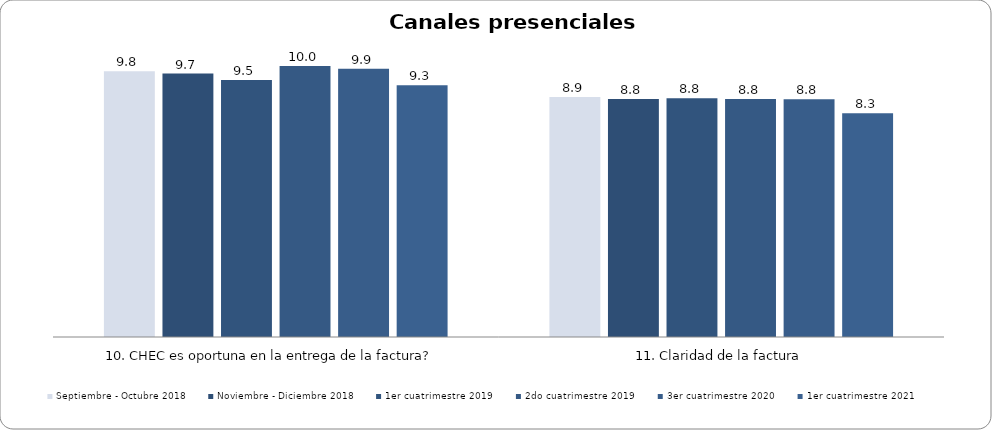
| Category | Septiembre - Octubre 2018 | Noviembre - Diciembre 2018 | 1er cuatrimestre 2019 | 2do cuatrimestre 2019 | 3er cuatrimestre 2020 | 1er cuatrimestre 2021 |
|---|---|---|---|---|---|---|
| 10. CHEC es oportuna en la entrega de la factura? | 9.808 | 9.722 | 9.485 | 10 | 9.896 | 9.291 |
| 11. Claridad de la factura | 8.86 | 8.786 | 8.812 | 8.783 | 8.777 | 8.252 |